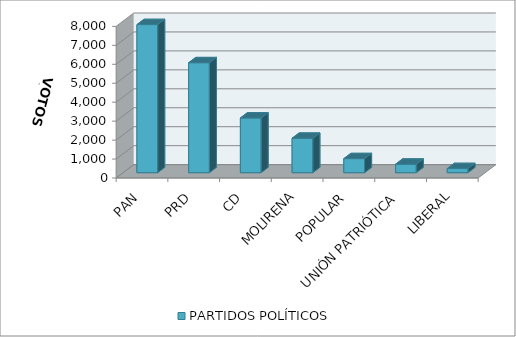
| Category | PARTIDOS POLÍTICOS |
|---|---|
| PAN | 7814 |
| PRD | 5802 |
| CD | 2887 |
| MOLIRENA | 1817 |
| POPULAR | 741 |
| UNIÓN PATRIÓTICA | 447 |
| LIBERAL | 218 |